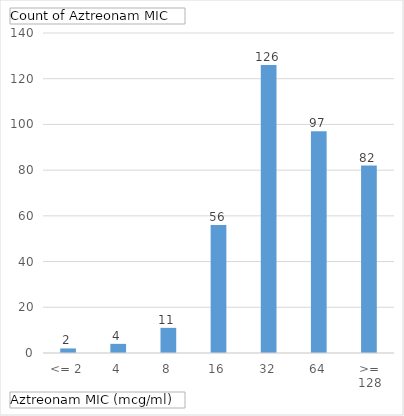
| Category | Total |
|---|---|
| <= 2 | 2 |
| 4 | 4 |
| 8 | 11 |
| 16 | 56 |
| 32 | 126 |
| 64 | 97 |
| >= 128 | 82 |